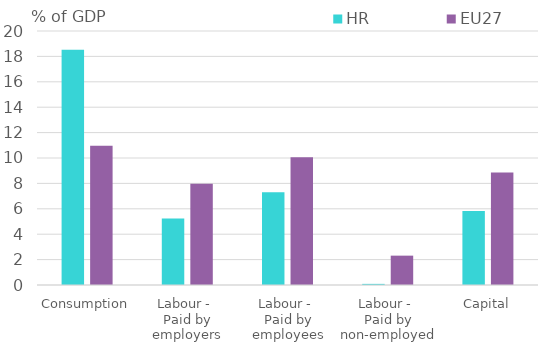
| Category | HR | EU27 |
|---|---|---|
| Consumption | 18.528 | 10.967 |
| Labour - 
Paid by employers | 5.226 | 7.966 |
| Labour - 
Paid by employees | 7.313 | 10.052 |
| Labour - 
Paid by non-employed | 0.088 | 2.311 |
| Capital | 5.833 | 8.858 |